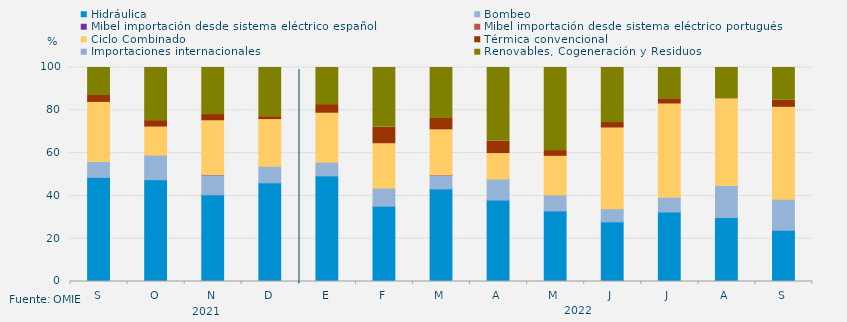
| Category | Hidráulica | Bombeo | Mibel importación desde sistema eléctrico español | Mibel importación desde sistema eléctrico portugués | Ciclo Combinado | Térmica convencional | Importaciones internacionales | Renovables, Cogeneración y Residuos |
|---|---|---|---|---|---|---|---|---|
| S | 48.657 | 7.384 | 0 | 0 | 27.639 | 3.245 | 0 | 13.097 |
| O | 47.584 | 11.477 | 0 | 0 | 13.093 | 3.021 | 0 | 24.843 |
| N | 40.532 | 9.282 | 0 | 0.139 | 25.139 | 2.917 | 0 | 21.991 |
| D | 46.102 | 7.728 | 0 | 0 | 21.841 | 1.344 | 0 | 22.984 |
| E | 49.362 | 6.328 | 0 | 0 | 22.928 | 4.032 | 0 | 17.35 |
| F | 35.193 | 8.333 | 0 | 0 | 20.833 | 7.664 | 0 | 27.976 |
| M | 43.282 | 6.472 | 0 | 0.135 | 20.962 | 5.328 | 0 | 23.822 |
| A | 38.032 | 9.861 | 0 | 0 | 11.875 | 5.741 | 0 | 34.491 |
| M | 32.975 | 7.504 | 0 | 0 | 18.011 | 2.688 | 0 | 38.822 |
| J | 27.87 | 6.134 | 0 | 0 | 37.708 | 2.569 | 0 | 25.718 |
| J | 32.46 | 6.855 | 0 | 0 | 43.616 | 2.487 | 0 | 14.583 |
| A | 29.861 | 14.964 | 0 | 0 | 40.479 | 0.134 | 0 | 14.561 |
| S | 23.935 | 14.514 | 0 | 0 | 42.94 | 3.264 | 0 | 15.347 |